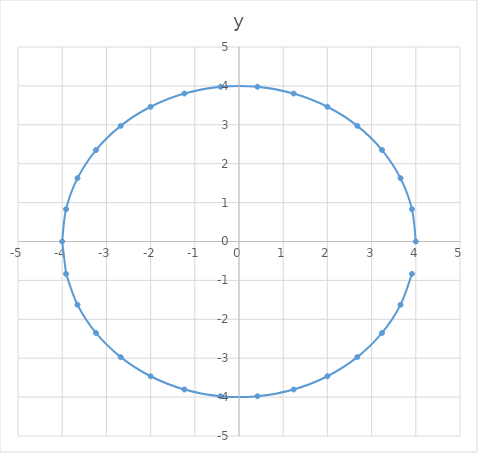
| Category | Series 0 |
|---|---|
| 4.0 | 0 |
| 3.9125904029352228 | 0.832 |
| 3.6541818305704035 | 1.627 |
| 3.23606797749979 | 2.351 |
| 2.676522425435433 | 2.973 |
| 2.0000000000000004 | 3.464 |
| 1.2360679774997898 | 3.804 |
| 0.41811385307061383 | 3.978 |
| -0.4181138530706142 | 3.978 |
| -1.2360679774997902 | 3.804 |
| -2.000000000000001 | 3.464 |
| -2.676522425435433 | 2.973 |
| -3.2360679774997894 | 2.351 |
| -3.654181830570403 | 1.627 |
| -3.9125904029352223 | 0.832 |
| -4.0 | 0 |
| -3.912590402935223 | -0.832 |
| -3.654181830570405 | -1.627 |
| -3.236067977499792 | -2.351 |
| -2.6765224254354365 | -2.973 |
| -2.000000000000005 | -3.464 |
| -1.2360679774997938 | -3.804 |
| -0.41811385307061694 | -3.978 |
| 0.41811385307061194 | -3.978 |
| 1.236067977499789 | -3.804 |
| 2.0000000000000004 | -3.464 |
| 2.676522425435434 | -2.973 |
| 3.236067977499791 | -2.351 |
| 3.6541818305704052 | -1.627 |
| 3.9125904029352236 | -0.832 |